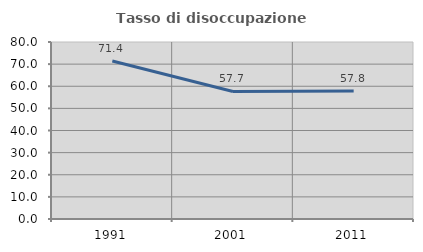
| Category | Tasso di disoccupazione giovanile  |
|---|---|
| 1991.0 | 71.429 |
| 2001.0 | 57.658 |
| 2011.0 | 57.831 |